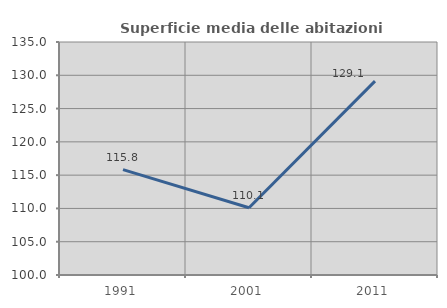
| Category | Superficie media delle abitazioni occupate |
|---|---|
| 1991.0 | 115.837 |
| 2001.0 | 110.108 |
| 2011.0 | 129.128 |